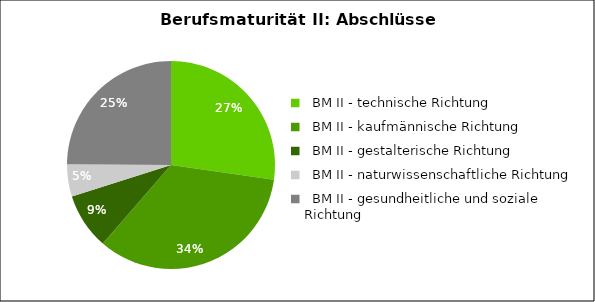
| Category | Series 0 |
|---|---|
|   BM II - technische Richtung | 103 |
|   BM II - kaufmännische Richtung                | 129 |
|   BM II - gestalterische Richtung               | 33 |
|   BM II - naturwissenschaftliche Richtung      | 19 |
|   BM II - gesundheitliche und soziale Richtung  | 94 |